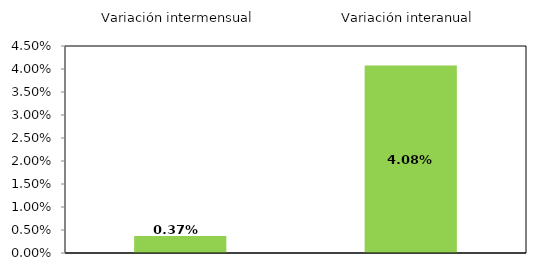
| Category | Series 0 |
|---|---|
| 0 | 0.367 |
| 1 | 4.076 |